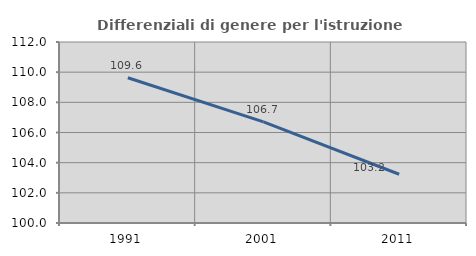
| Category | Differenziali di genere per l'istruzione superiore |
|---|---|
| 1991.0 | 109.632 |
| 2001.0 | 106.702 |
| 2011.0 | 103.232 |